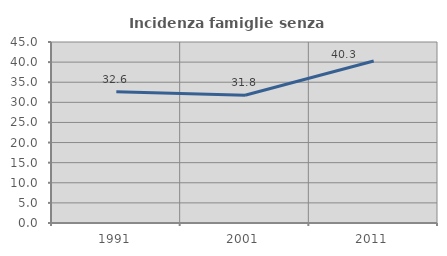
| Category | Incidenza famiglie senza nuclei |
|---|---|
| 1991.0 | 32.649 |
| 2001.0 | 31.757 |
| 2011.0 | 40.259 |